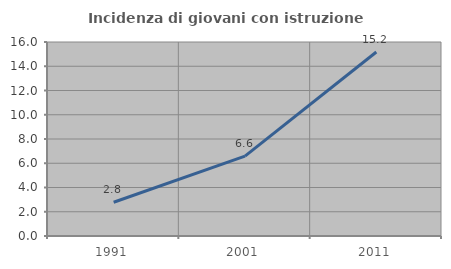
| Category | Incidenza di giovani con istruzione universitaria |
|---|---|
| 1991.0 | 2.783 |
| 2001.0 | 6.587 |
| 2011.0 | 15.179 |